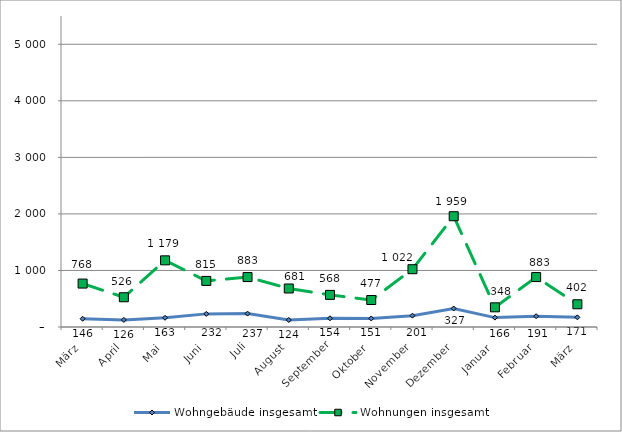
| Category | Wohngebäude insgesamt | Wohnungen insgesamt |
|---|---|---|
| März | 146 | 768 |
| April | 126 | 526 |
| Mai | 163 | 1179 |
| Juni | 232 | 815 |
| Juli | 237 | 883 |
| August | 124 | 681 |
| September | 154 | 568 |
| Oktober | 151 | 477 |
| November | 201 | 1022 |
| Dezember | 327 | 1959 |
| Januar | 166 | 348 |
| Februar | 191 | 883 |
| März | 171 | 402 |